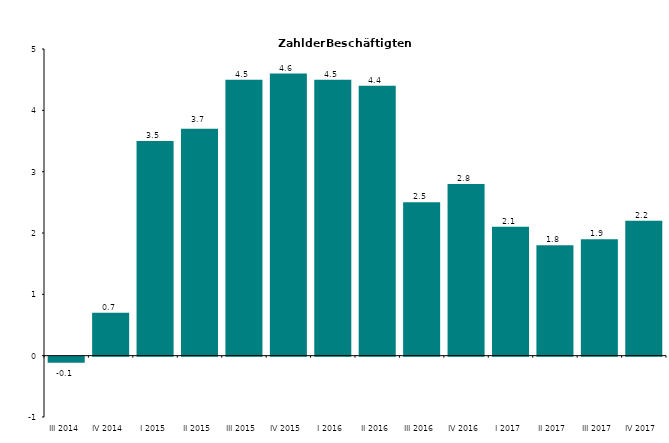
| Category | Series 0 |
|---|---|
| III 2014 | -0.1 |
| IV 2014 | 0.7 |
| I 2015 | 3.5 |
| II 2015 | 3.7 |
| III 2015 | 4.5 |
| IV 2015 | 4.6 |
| I 2016 | 4.5 |
| II 2016 | 4.4 |
| III 2016 | 2.5 |
| IV 2016 | 2.8 |
| I 2017 | 2.1 |
| II 2017 | 1.8 |
| III 2017 | 1.9 |
| IV 2017 | 2.2 |